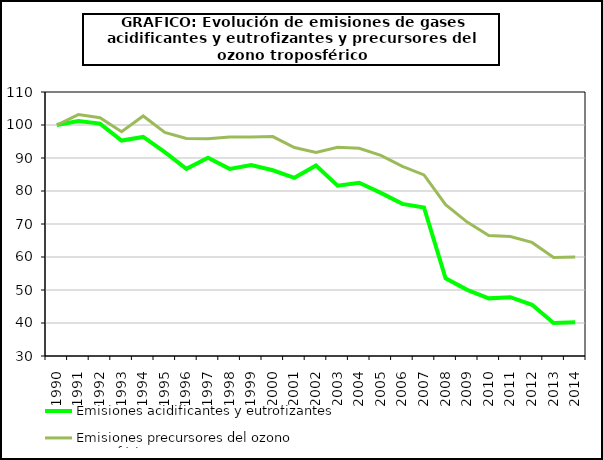
| Category | Emisiones acidificantes y eutrofizantes  | Emisiones precursores del ozono troposférico  |
|---|---|---|
| 1990.0 | 100 | 100 |
| 1991.0 | 101.203 | 103.141 |
| 1992.0 | 100.436 | 102.196 |
| 1993.0 | 95.287 | 97.963 |
| 1994.0 | 96.376 | 102.732 |
| 1995.0 | 91.805 | 97.738 |
| 1996.0 | 86.732 | 95.913 |
| 1997.0 | 90.109 | 95.824 |
| 1998.0 | 86.71 | 96.387 |
| 1999.0 | 87.875 | 96.347 |
| 2000.0 | 86.285 | 96.486 |
| 2001.0 | 83.987 | 93.155 |
| 2002.0 | 87.751 | 91.71 |
| 2003.0 | 81.624 | 93.223 |
| 2004.0 | 82.508 | 92.949 |
| 2005.0 | 79.435 | 90.781 |
| 2006.0 | 76.098 | 87.482 |
| 2007.0 | 75.027 | 84.877 |
| 2008.0 | 53.555 | 75.859 |
| 2009.0 | 50.04 | 70.566 |
| 2010.0 | 47.466 | 66.495 |
| 2011.0 | 47.808 | 66.192 |
| 2012.0 | 45.509 | 64.418 |
| 2013.0 | 40.02 | 59.853 |
| 2014.0 | 40.197 | 60.003 |